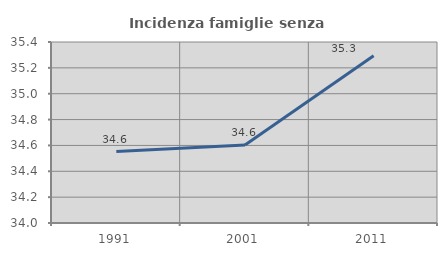
| Category | Incidenza famiglie senza nuclei |
|---|---|
| 1991.0 | 34.553 |
| 2001.0 | 34.603 |
| 2011.0 | 35.294 |